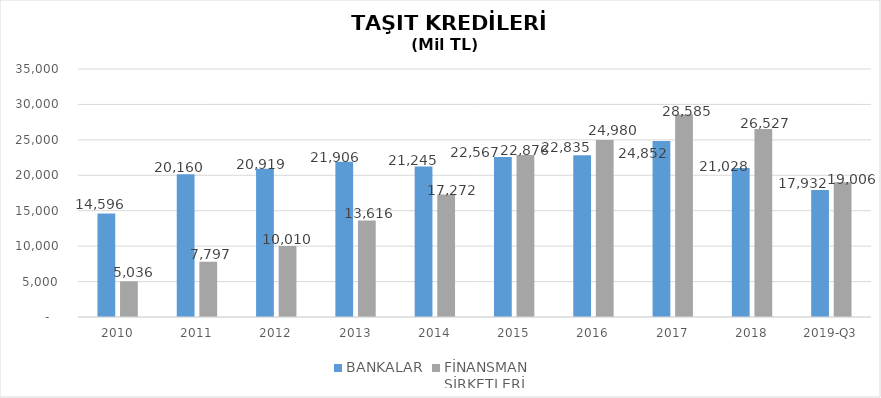
| Category | BANKALAR | FİNANSMAN 
ŞİRKETLERİ |
|---|---|---|
| 2010 | 14596 | 5035.89 |
| 2011 | 20160 | 7796.854 |
| 2012 | 20919 | 10009.755 |
| 2013 | 21906 | 13616.036 |
| 2014 | 21245 | 17271.844 |
| 2015 | 22567 | 22875.563 |
| 2016 | 22835 | 24980.231 |
| 2017 | 24852 | 28584.938 |
| 2018 | 21028 | 26527.133 |
| 2019-Q3 | 17932 | 19006.22 |